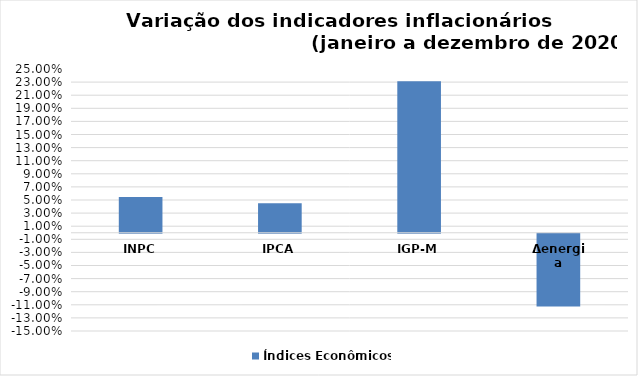
| Category | Índices Econômicos |
|---|---|
| INPC | 0.054 |
| IPCA | 0.045 |
| IGP-M | 0.231 |
| Δenergia | -0.111 |